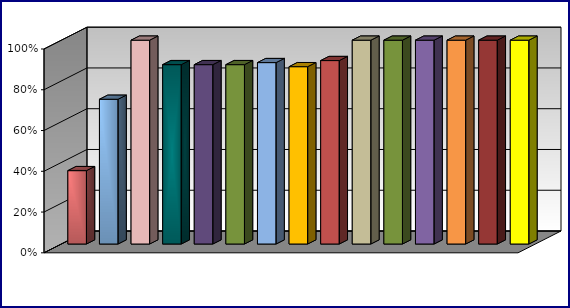
| Category | Series 0 | Series 1 | Series 2 | Series 3 |
|---|---|---|---|---|
| 0 | 0.36 |  |  |  |
| 1 | 0.71 |  |  |  |
| 2 | 1 |  |  |  |
| 3 | 0.88 |  |  |  |
| 4 | 0.88 |  |  |  |
| 5 | 0.88 |  |  |  |
| 6 | 0.89 |  |  |  |
| 7 | 0.87 |  |  |  |
| 8 | 0.9 |  |  |  |
| 9 | 1 |  |  |  |
| 10 | 1 |  |  |  |
| 11 | 1 |  |  |  |
| 12 | 1 |  |  |  |
| 13 | 1 |  |  |  |
| 14 | 1 |  |  |  |